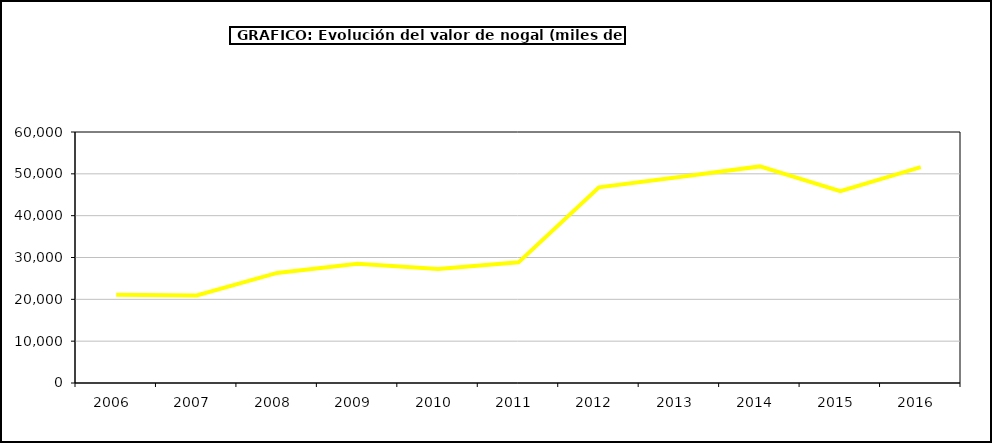
| Category | valor nogal |
|---|---|
| 2006.0 | 21082.074 |
| 2007.0 | 20930.205 |
| 2008.0 | 26319.546 |
| 2009.0 | 28498.427 |
| 2010.0 | 27232.257 |
| 2011.0 | 28841.576 |
| 2012.0 | 46777.981 |
| 2013.0 | 49217.301 |
| 2014.0 | 51776.04 |
| 2015.0 | 45857 |
| 2016.0 | 51595 |